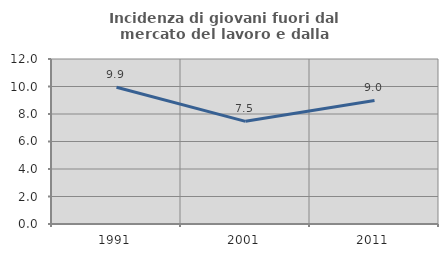
| Category | Incidenza di giovani fuori dal mercato del lavoro e dalla formazione  |
|---|---|
| 1991.0 | 9.943 |
| 2001.0 | 7.466 |
| 2011.0 | 8.986 |